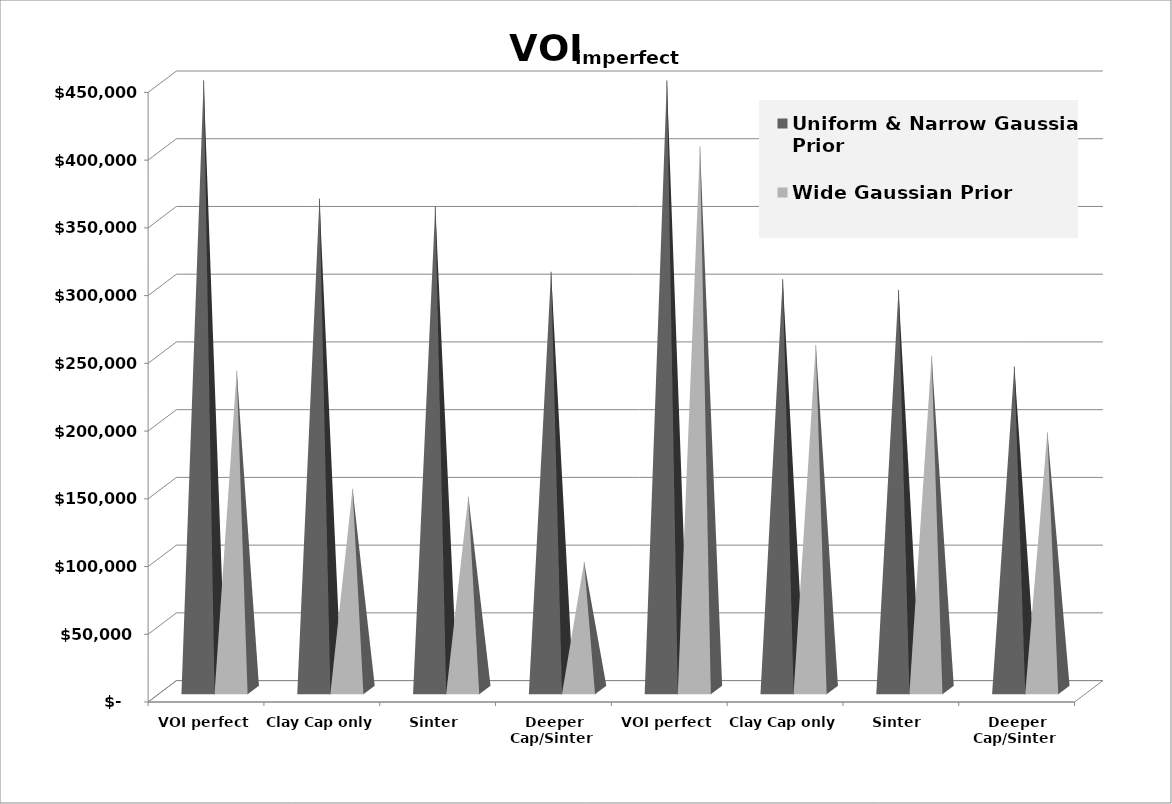
| Category | Uniform & Narrow Gaussian Prior | Wide Gaussian Prior |
|---|---|---|
| VOI perfect | 450000 | 235756 |
| Clay Cap only | 362715 | 148471 |
| Sinter  | 356890 | 142646 |
| Deeper Cap/Sinter  | 308785 | 94542 |
| VOI perfect | 450000 | 401418 |
| Clay Cap only | 303250 | 254668 |
| Sinter  | 295250 | 246669 |
| Deeper Cap/Sinter  | 238800 | 190218 |